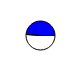
| Category | Series 0 |
|---|---|
| 0 | 6081628 |
| 1 | 5816107 |